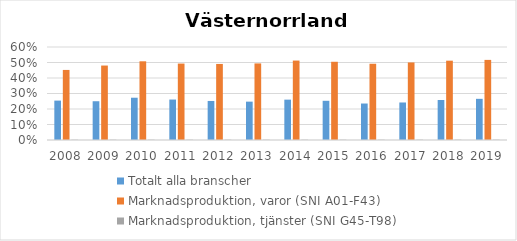
| Category | Totalt alla branscher | Marknadsproduktion, varor (SNI A01-F43) | Marknadsproduktion, tjänster (SNI G45-T98) |
|---|---|---|---|
| 2008 | 0.254 | 0.452 | 0.002 |
| 2009 | 0.25 | 0.48 | 0.002 |
| 2010 | 0.273 | 0.508 | 0.002 |
| 2011 | 0.261 | 0.493 | 0.002 |
| 2012 | 0.252 | 0.491 | 0.002 |
| 2013 | 0.247 | 0.494 | 0.002 |
| 2014 | 0.26 | 0.512 | 0.002 |
| 2015 | 0.253 | 0.505 | 0.002 |
| 2016 | 0.235 | 0.492 | 0.002 |
| 2017 | 0.242 | 0.5 | 0.002 |
| 2018 | 0.258 | 0.512 | 0.002 |
| 2019 | 0.266 | 0.517 | 0.002 |